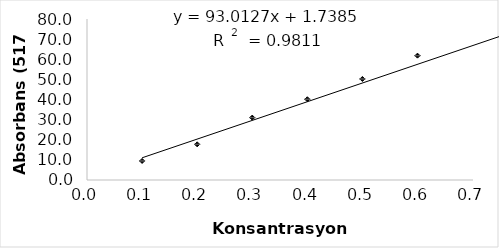
| Category | Series 0 |
|---|---|
| 0.09988413440409126 | 9.471 |
| 0.19976826880818252 | 17.718 |
| 0.29965240321227377 | 31.012 |
| 0.39953653761636504 | 40.117 |
| 0.4994206720204563 | 50.201 |
| 0.5993048064245475 | 61.788 |
| 0.7990730752327301 | 71.288 |